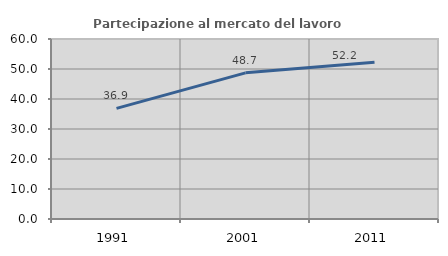
| Category | Partecipazione al mercato del lavoro  femminile |
|---|---|
| 1991.0 | 36.877 |
| 2001.0 | 48.714 |
| 2011.0 | 52.222 |